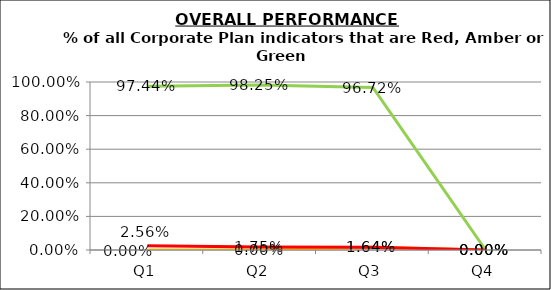
| Category | Green | Amber | Red |
|---|---|---|---|
| Q1 | 0.974 | 0 | 0.026 |
| Q2 | 0.982 | 0 | 0.018 |
| Q3 | 0.967 | 0.016 | 0.016 |
| Q4 | 0 | 0 | 0 |